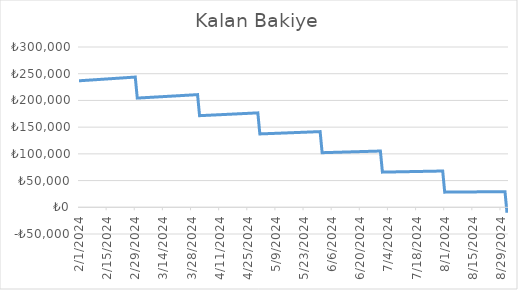
| Category | Kalan Bakiye |
|---|---|
| 2/1/24 | 236756.3 |
| 2/2/24 | 237002.113 |
| 2/3/24 | 237248.18 |
| 2/4/24 | 237494.504 |
| 2/5/24 | 237741.083 |
| 2/6/24 | 237987.918 |
| 2/7/24 | 238235.009 |
| 2/8/24 | 238482.357 |
| 2/9/24 | 238729.961 |
| 2/10/24 | 238977.823 |
| 2/11/24 | 239225.942 |
| 2/12/24 | 239474.319 |
| 2/13/24 | 239722.953 |
| 2/14/24 | 239971.846 |
| 2/15/24 | 240220.997 |
| 2/16/24 | 240470.407 |
| 2/17/24 | 240720.076 |
| 2/18/24 | 240970.003 |
| 2/19/24 | 241220.191 |
| 2/20/24 | 241470.638 |
| 2/21/24 | 241721.345 |
| 2/22/24 | 241972.313 |
| 2/23/24 | 242223.541 |
| 2/24/24 | 242475.03 |
| 2/25/24 | 242726.78 |
| 2/26/24 | 242978.791 |
| 2/27/24 | 243231.064 |
| 2/28/24 | 243483.599 |
| 2/29/24 | 243736.397 |
| 3/1/24 | 204389.456 |
| 3/2/24 | 204601.664 |
| 3/3/24 | 204814.092 |
| 3/4/24 | 205026.74 |
| 3/5/24 | 205239.61 |
| 3/6/24 | 205452.7 |
| 3/7/24 | 205666.011 |
| 3/8/24 | 205879.544 |
| 3/9/24 | 206093.299 |
| 3/10/24 | 206307.276 |
| 3/11/24 | 206521.475 |
| 3/12/24 | 206735.896 |
| 3/13/24 | 206950.54 |
| 3/14/24 | 207165.406 |
| 3/15/24 | 207380.496 |
| 3/16/24 | 207595.809 |
| 3/17/24 | 207811.346 |
| 3/18/24 | 208027.106 |
| 3/19/24 | 208243.091 |
| 3/20/24 | 208459.299 |
| 3/21/24 | 208675.732 |
| 3/22/24 | 208892.39 |
| 3/23/24 | 209109.273 |
| 3/24/24 | 209326.381 |
| 3/25/24 | 209543.715 |
| 3/26/24 | 209761.274 |
| 3/27/24 | 209979.059 |
| 3/28/24 | 210197.07 |
| 3/29/24 | 210415.307 |
| 3/30/24 | 210633.771 |
| 3/31/24 | 210852.462 |
| 4/1/24 | 171471.38 |
| 4/2/24 | 171649.41 |
| 4/3/24 | 171827.625 |
| 4/4/24 | 172006.025 |
| 4/5/24 | 172184.611 |
| 4/6/24 | 172363.382 |
| 4/7/24 | 172542.338 |
| 4/8/24 | 172721.481 |
| 4/9/24 | 172900.809 |
| 4/10/24 | 173080.324 |
| 4/11/24 | 173260.024 |
| 4/12/24 | 173439.912 |
| 4/13/24 | 173619.986 |
| 4/14/24 | 173800.247 |
| 4/15/24 | 173980.696 |
| 4/16/24 | 174161.331 |
| 4/17/24 | 174342.155 |
| 4/18/24 | 174523.166 |
| 4/19/24 | 174704.364 |
| 4/20/24 | 174885.752 |
| 4/21/24 | 175067.327 |
| 4/22/24 | 175249.091 |
| 4/23/24 | 175431.043 |
| 4/24/24 | 175613.185 |
| 4/25/24 | 175795.516 |
| 4/26/24 | 175978.035 |
| 4/27/24 | 176160.745 |
| 4/28/24 | 176343.644 |
| 4/29/24 | 176526.733 |
| 4/30/24 | 176710.012 |
| 5/1/24 | 137293.482 |
| 5/2/24 | 137436.027 |
| 5/3/24 | 137578.72 |
| 5/4/24 | 137721.561 |
| 5/5/24 | 137864.551 |
| 5/6/24 | 138007.689 |
| 5/7/24 | 138150.976 |
| 5/8/24 | 138294.411 |
| 5/9/24 | 138437.995 |
| 5/10/24 | 138581.729 |
| 5/11/24 | 138725.611 |
| 5/12/24 | 138869.643 |
| 5/13/24 | 139013.825 |
| 5/14/24 | 139158.156 |
| 5/15/24 | 139302.638 |
| 5/16/24 | 139447.269 |
| 5/17/24 | 139592.05 |
| 5/18/24 | 139736.982 |
| 5/19/24 | 139882.064 |
| 5/20/24 | 140027.296 |
| 5/21/24 | 140172.68 |
| 5/22/24 | 140318.214 |
| 5/23/24 | 140463.9 |
| 5/24/24 | 140609.737 |
| 5/25/24 | 140755.725 |
| 5/26/24 | 140901.865 |
| 5/27/24 | 141048.157 |
| 5/28/24 | 141194.6 |
| 5/29/24 | 141341.195 |
| 5/30/24 | 141487.943 |
| 5/31/24 | 141634.843 |
| 6/1/24 | 102181.896 |
| 6/2/24 | 102287.986 |
| 6/3/24 | 102394.187 |
| 6/4/24 | 102500.498 |
| 6/5/24 | 102606.919 |
| 6/6/24 | 102713.451 |
| 6/7/24 | 102820.093 |
| 6/8/24 | 102926.846 |
| 6/9/24 | 103033.71 |
| 6/10/24 | 103140.685 |
| 6/11/24 | 103247.771 |
| 6/12/24 | 103354.968 |
| 6/13/24 | 103462.277 |
| 6/14/24 | 103569.697 |
| 6/15/24 | 103677.228 |
| 6/16/24 | 103784.871 |
| 6/17/24 | 103892.626 |
| 6/18/24 | 104000.492 |
| 6/19/24 | 104108.471 |
| 6/20/24 | 104216.562 |
| 6/21/24 | 104324.765 |
| 6/22/24 | 104433.08 |
| 6/23/24 | 104541.508 |
| 6/24/24 | 104650.048 |
| 6/25/24 | 104758.701 |
| 6/26/24 | 104867.467 |
| 6/27/24 | 104976.346 |
| 6/28/24 | 105085.338 |
| 6/29/24 | 105194.443 |
| 6/30/24 | 105303.661 |
| 7/1/24 | 65812.993 |
| 7/2/24 | 65881.323 |
| 7/3/24 | 65949.725 |
| 7/4/24 | 66018.197 |
| 7/5/24 | 66086.74 |
| 7/6/24 | 66155.355 |
| 7/7/24 | 66224.041 |
| 7/8/24 | 66292.798 |
| 7/9/24 | 66361.627 |
| 7/10/24 | 66430.527 |
| 7/11/24 | 66499.498 |
| 7/12/24 | 66568.542 |
| 7/13/24 | 66637.656 |
| 7/14/24 | 66706.843 |
| 7/15/24 | 66776.102 |
| 7/16/24 | 66845.432 |
| 7/17/24 | 66914.834 |
| 7/18/24 | 66984.309 |
| 7/19/24 | 67053.855 |
| 7/20/24 | 67123.474 |
| 7/21/24 | 67193.165 |
| 7/22/24 | 67262.928 |
| 7/23/24 | 67332.764 |
| 7/24/24 | 67402.673 |
| 7/25/24 | 67472.654 |
| 7/26/24 | 67542.707 |
| 7/27/24 | 67612.833 |
| 7/28/24 | 67683.033 |
| 7/29/24 | 67753.305 |
| 7/30/24 | 67823.65 |
| 7/31/24 | 67894.068 |
| 8/1/24 | 28364.559 |
| 8/2/24 | 28394.008 |
| 8/3/24 | 28423.488 |
| 8/4/24 | 28452.999 |
| 8/5/24 | 28482.54 |
| 8/6/24 | 28512.112 |
| 8/7/24 | 28541.715 |
| 8/8/24 | 28571.349 |
| 8/9/24 | 28601.013 |
| 8/10/24 | 28630.708 |
| 8/11/24 | 28660.434 |
| 8/12/24 | 28690.191 |
| 8/13/24 | 28719.978 |
| 8/14/24 | 28749.797 |
| 8/15/24 | 28779.646 |
| 8/16/24 | 28809.527 |
| 8/17/24 | 28839.438 |
| 8/18/24 | 28869.381 |
| 8/19/24 | 28899.355 |
| 8/20/24 | 28929.359 |
| 8/21/24 | 28959.395 |
| 8/22/24 | 28989.462 |
| 8/23/24 | 29019.561 |
| 8/24/24 | 29049.69 |
| 8/25/24 | 29079.851 |
| 8/26/24 | 29110.043 |
| 8/27/24 | 29140.267 |
| 8/28/24 | 29170.522 |
| 8/29/24 | 29200.808 |
| 8/30/24 | 29231.126 |
| 8/31/24 | 29261.475 |
| 9/1/24 | -10308.144 |